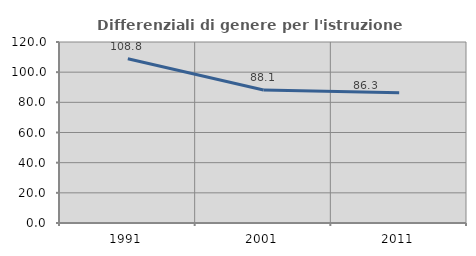
| Category | Differenziali di genere per l'istruzione superiore |
|---|---|
| 1991.0 | 108.842 |
| 2001.0 | 88.147 |
| 2011.0 | 86.344 |